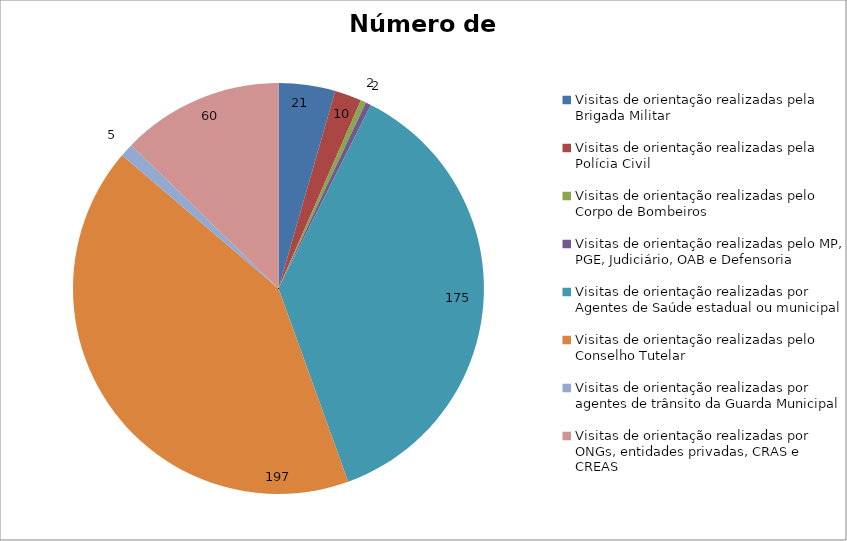
| Category | Número de Ações |
|---|---|
| Visitas de orientação realizadas pela Brigada Militar | 21 |
| Visitas de orientação realizadas pela Polícia Civil | 10 |
| Visitas de orientação realizadas pelo Corpo de Bombeiros | 2 |
| Visitas de orientação realizadas pelo MP, PGE, Judiciário, OAB e Defensoria | 2 |
| Visitas de orientação realizadas por Agentes de Saúde estadual ou municipal | 175 |
| Visitas de orientação realizadas pelo Conselho Tutelar | 197 |
| Visitas de orientação realizadas por agentes de trânsito da Guarda Municipal | 5 |
| Visitas de orientação realizadas por ONGs, entidades privadas, CRAS e CREAS | 60 |